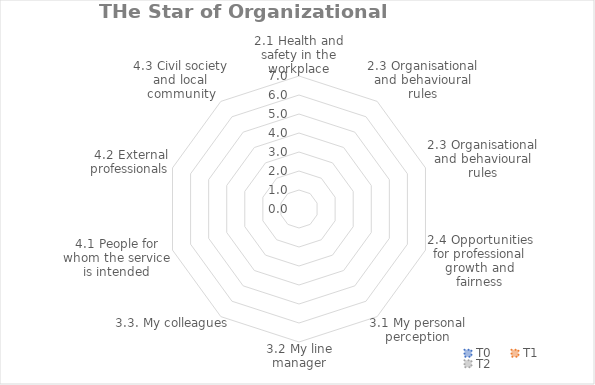
| Category | T0 | T1 | T2 |
|---|---|---|---|
| 2.1 Health and safety in the workplace | 0 | 0 | 0 |
| 2.3 Organisational and behavioural rules | 0 | 0 | 0 |
| 2.3 Organisational and behavioural rules | 0 | 0 | 0 |
| 2.4 Opportunities for professional growth and fairness | 0 | 0 | 0 |
| 3.1 My personal perception | 0 | 0 | 0 |
| 3.2 My line manager | 0 | 0 | 0 |
| 3.3. My colleagues | 0 | 0 | 0 |
| 4.1 People for whom the service is intended | 0 | 0 | 0 |
| 4.2 External professionals | 0 | 0 | 0 |
| 4.3 Civil society and local community | 0 | 0 | 0 |